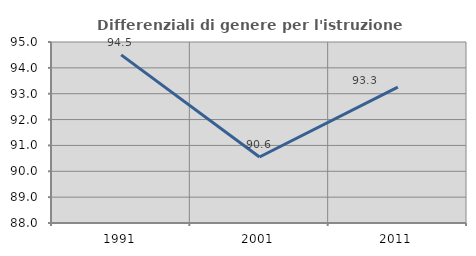
| Category | Differenziali di genere per l'istruzione superiore |
|---|---|
| 1991.0 | 94.503 |
| 2001.0 | 90.552 |
| 2011.0 | 93.255 |